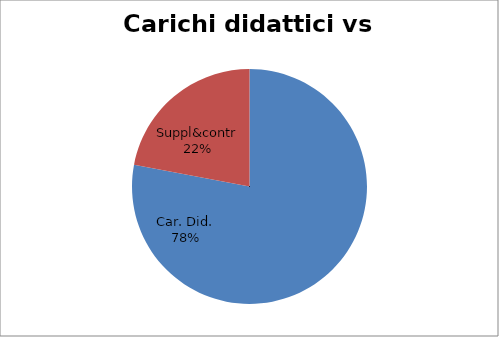
| Category | Series 0 |
|---|---|
| Car. Did. | 0.78 |
| Suppl&contr | 0.22 |